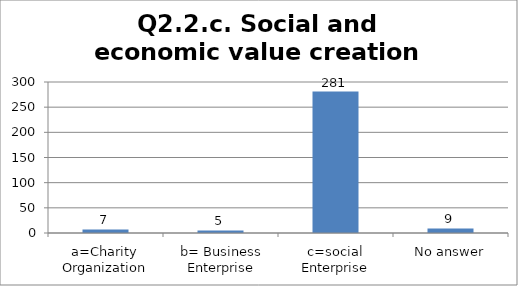
| Category | Q2.2.c. Social and economic value creation |
|---|---|
| a=Charity Organization | 7 |
| b= Business Enterprise | 5 |
| c=social Enterprise | 281 |
| No answer | 9 |